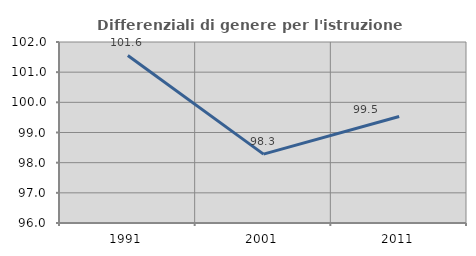
| Category | Differenziali di genere per l'istruzione superiore |
|---|---|
| 1991.0 | 101.554 |
| 2001.0 | 98.282 |
| 2011.0 | 99.531 |